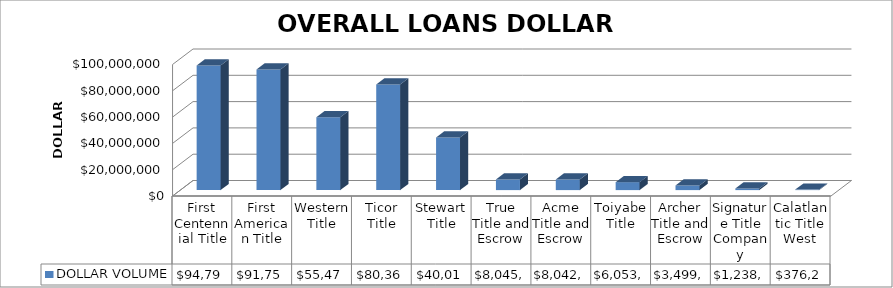
| Category | DOLLAR VOLUME |
|---|---|
| First Centennial Title | 94796685.85 |
| First American Title | 91752116 |
| Western Title | 55475319 |
| Ticor Title | 80363280.9 |
| Stewart Title | 40015907.6 |
| True Title and Escrow | 8045649 |
| Acme Title and Escrow | 8042799 |
| Toiyabe Title | 6053310 |
| Archer Title and Escrow | 3499487 |
| Signature Title Company | 1238350 |
| Calatlantic Title West | 376203 |